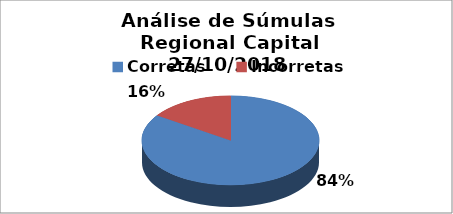
| Category | Series 0 |
|---|---|
| Corretas | 49 |
| Incorretas | 9 |